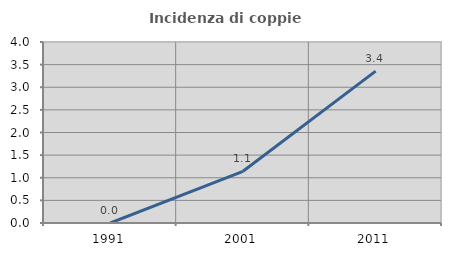
| Category | Incidenza di coppie miste |
|---|---|
| 1991.0 | 0 |
| 2001.0 | 1.143 |
| 2011.0 | 3.356 |